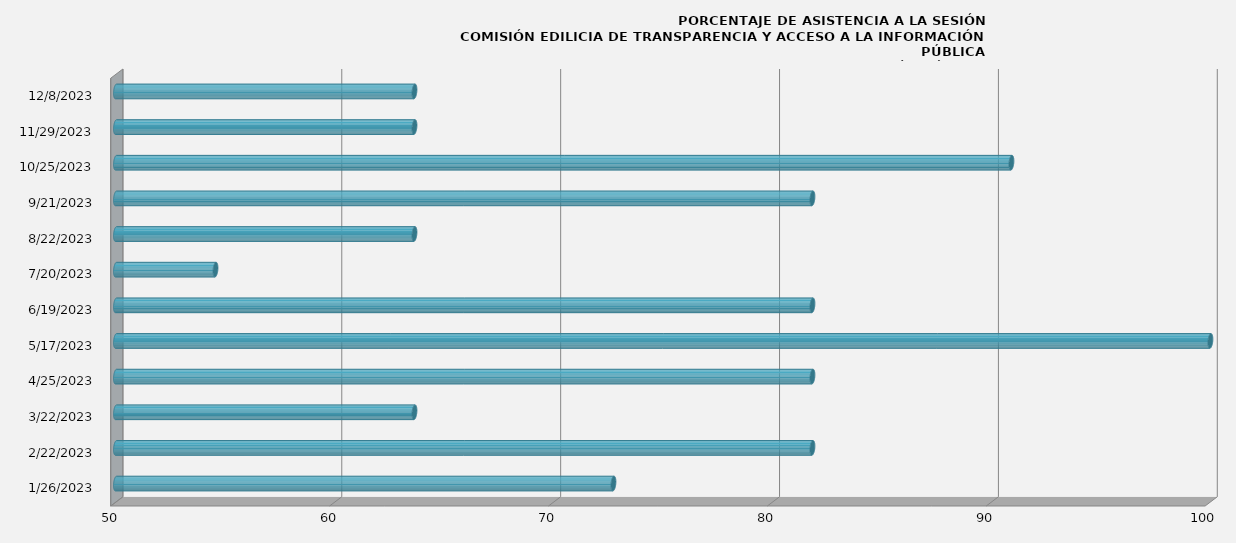
| Category | Series 0 |
|---|---|
| 1/26/23 | 72.727 |
| 2/22/23 | 81.818 |
| 3/22/23 | 63.636 |
| 4/25/23 | 81.818 |
| 5/17/23 | 100 |
| 6/19/23 | 81.818 |
| 7/20/23 | 54.545 |
| 8/22/23 | 63.636 |
| 9/21/23 | 81.818 |
| 10/25/23 | 90.909 |
| 11/29/23 | 63.636 |
| 12/8/23 | 63.636 |